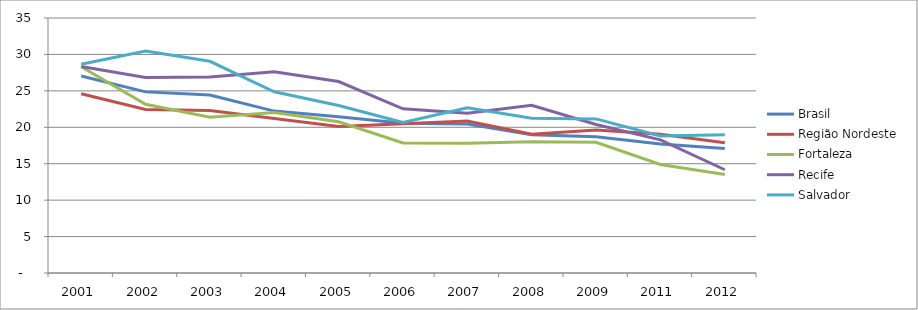
| Category | Brasil | Região Nordeste | Fortaleza | Recife | Salvador |
|---|---|---|---|---|---|
| 2001.0 | 27.04 | 24.61 | 28.3 | 28.33 | 28.64 |
| 2002.0 | 24.86 | 22.44 | 23.16 | 26.82 | 30.46 |
| 2003.0 | 24.44 | 22.31 | 21.38 | 26.9 | 29.06 |
| 2004.0 | 22.22 | 21.2 | 22.03 | 27.62 | 24.88 |
| 2005.0 | 21.43 | 20.11 | 20.76 | 26.28 | 22.99 |
| 2006.0 | 20.56 | 20.48 | 17.86 | 22.54 | 20.65 |
| 2007.0 | 20.46 | 20.85 | 17.81 | 21.93 | 22.67 |
| 2008.0 | 18.98 | 19.04 | 18.01 | 23.02 | 21.24 |
| 2009.0 | 18.7 | 19.64 | 17.93 | 20.39 | 21.15 |
| 2011.0 | 17.71 | 19.04 | 14.9 | 18.28 | 18.82 |
| 2012.0 | 17.09 | 17.89 | 13.53 | 14.17 | 18.98 |